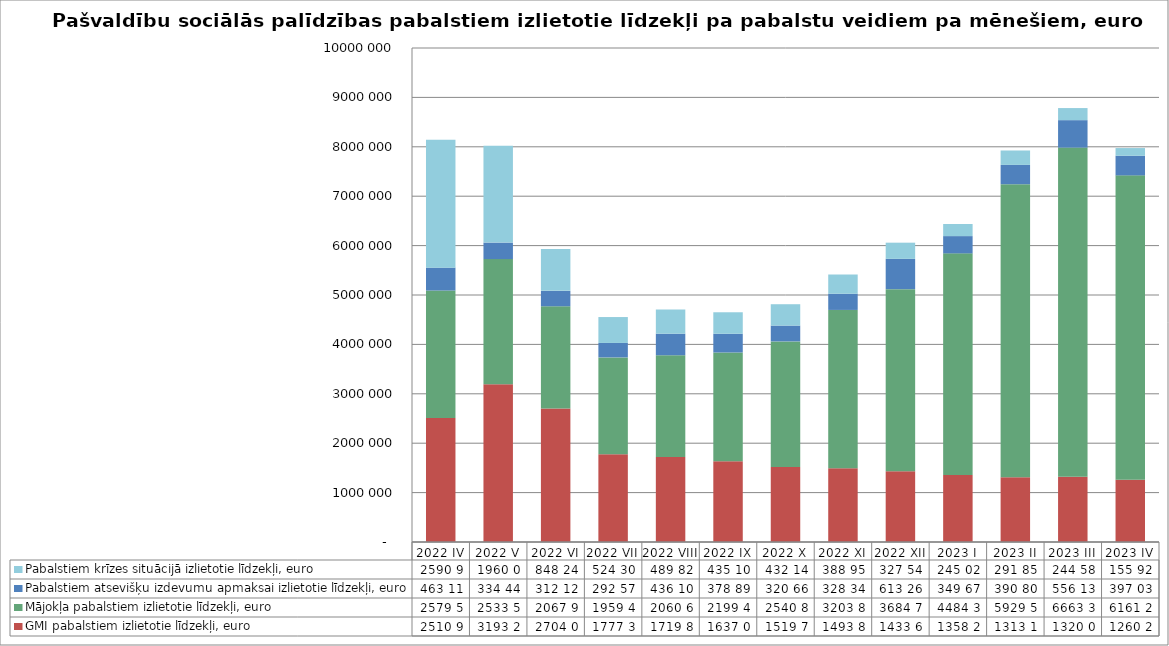
| Category | GMI pabalstiem izlietotie līdzekļi, euro | Mājokļa pabalstiem izlietotie līdzekļi, euro | Pabalstiem atsevišķu izdevumu apmaksai izlietotie līdzekļi, euro | Pabalstiem krīzes situācijā izlietotie līdzekļi, euro |
|---|---|---|---|---|
| 2022 IV | 2510948 | 2579552 | 463111 | 2590974 |
| 2022 V | 3193273 | 2533564 | 334444 | 1960051 |
| 2022 VI | 2704016 | 2067966 | 312126 | 848241 |
| 2022 VII | 1777318 | 1959481 | 292573 | 524300 |
| 2022 VIII | 1719814 | 2060684 | 436108 | 489826 |
| 2022 IX | 1637094 | 2199417 | 378898 | 435103 |
| 2022 X | 1519767 | 2540805 | 320669 | 432145 |
| 2022 XI | 1493823 | 3203820 | 328342 | 388951 |
| 2022 XII | 1433674 | 3684701 | 613260 | 327541 |
| 2023 I | 1358282 | 4484384 | 349670 | 245024 |
| 2023 II | 1313168 | 5929524 | 390807 | 291852 |
| 2023 III | 1320028 | 6663392 | 556130 | 244581 |
| 2023 IV | 1260284 | 6161284 | 397039 | 155929 |